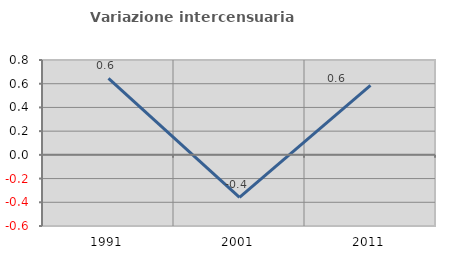
| Category | Variazione intercensuaria annua |
|---|---|
| 1991.0 | 0.645 |
| 2001.0 | -0.359 |
| 2011.0 | 0.587 |